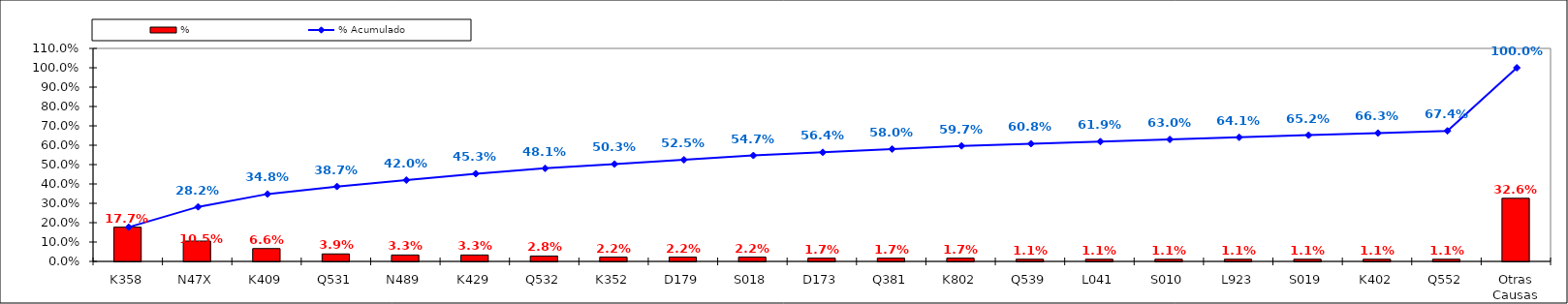
| Category | % |
|---|---|
| K358 | 0.177 |
| N47X | 0.105 |
| K409 | 0.066 |
| Q531 | 0.039 |
| N489 | 0.033 |
| K429 | 0.033 |
| Q532 | 0.028 |
| K352 | 0.022 |
| D179 | 0.022 |
| S018 | 0.022 |
| D173 | 0.017 |
| Q381 | 0.017 |
| K802 | 0.017 |
| Q539 | 0.011 |
| L041 | 0.011 |
| S010 | 0.011 |
| L923 | 0.011 |
| S019 | 0.011 |
| K402 | 0.011 |
| Q552 | 0.011 |
| Otras Causas | 0.326 |